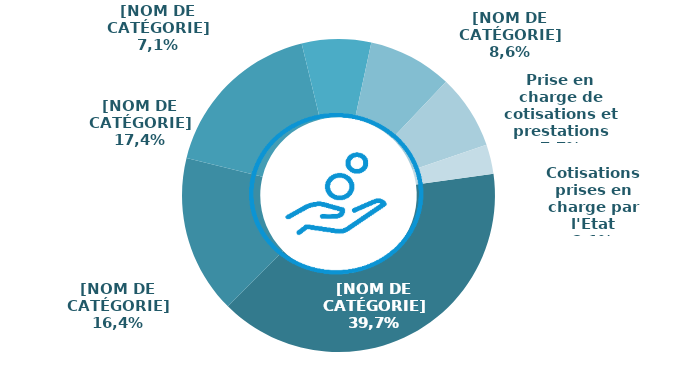
| Category | Series 0 |
|---|---|
| Cotisations sociales | 6303.985 |
| Compensation démographique | 2596.603 |
| Contributions du régime général | 2758.14 |
| Contribution sociale généralisée | 1134.804 |
| Autres produits + ITAF | 1378.396 |
| Prise en charge de cotisations et prestations | 1219.966 |
| Cotisations prises en charge par l'Etat | 483.458 |